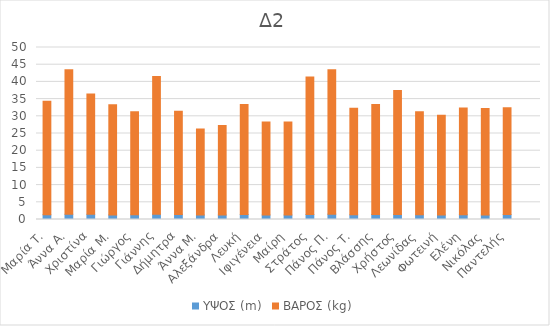
| Category | ΥΨΟΣ (m) | ΒΑΡΟΣ (kg) |
|---|---|---|
| Μαρία Τ. | 1.4 | 33 |
| Άννα Α. | 1.52 | 42 |
| Χριστίνα | 1.5 | 35 |
| Μαρία Μ. | 1.33 | 32 |
| Γιώργος | 1.35 | 30 |
| Γιάννης | 1.55 | 40 |
| Δήμητρα | 1.47 | 30 |
| Άννα Μ. | 1.31 | 25 |
| Αλεξάνδρα | 1.32 | 26 |
| Λευκή | 1.45 | 32 |
| Ιφιγένεια | 1.32 | 27 |
| Μαίρη | 1.32 | 27 |
| Στράτος | 1.45 | 40 |
| Πάνος Π. | 1.56 | 42 |
| Πάνος Τ. | 1.35 | 31 |
| Βλάσσης | 1.46 | 32 |
| Χρήστος | 1.47 | 36 |
| Λεωνίδας | 1.35 | 30 |
| Φωτεινή | 1.34 | 29 |
| Ελένη | 1.4 | 31 |
| Νικόλας | 1.3 | 31 |
| Παντελής | 1.47 | 31 |